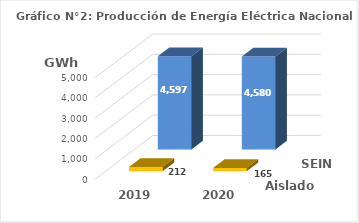
| Category | Aislados | SEIN |
|---|---|---|
| 2019.0 | 212.277 | 4596.568 |
| 2020.0 | 164.702 | 4580.173 |